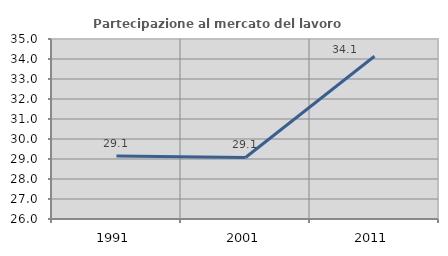
| Category | Partecipazione al mercato del lavoro  femminile |
|---|---|
| 1991.0 | 29.145 |
| 2001.0 | 29.076 |
| 2011.0 | 34.136 |